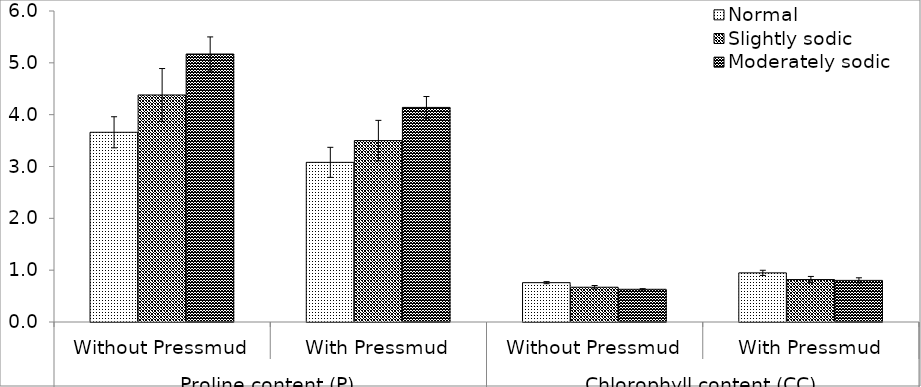
| Category | Normal | Slightly sodic | Moderately sodic |
|---|---|---|---|
| 0 | 3.66 | 4.38 | 5.17 |
| 1 | 3.08 | 3.5 | 4.14 |
| 2 | 0.759 | 0.671 | 0.631 |
| 3 | 0.948 | 0.819 | 0.803 |